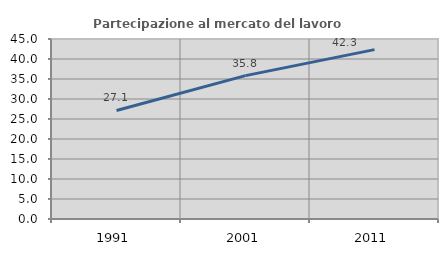
| Category | Partecipazione al mercato del lavoro  femminile |
|---|---|
| 1991.0 | 27.132 |
| 2001.0 | 35.849 |
| 2011.0 | 42.347 |